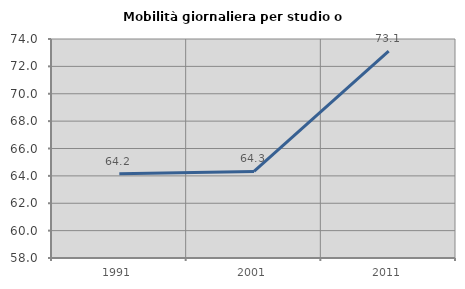
| Category | Mobilità giornaliera per studio o lavoro |
|---|---|
| 1991.0 | 64.153 |
| 2001.0 | 64.327 |
| 2011.0 | 73.121 |